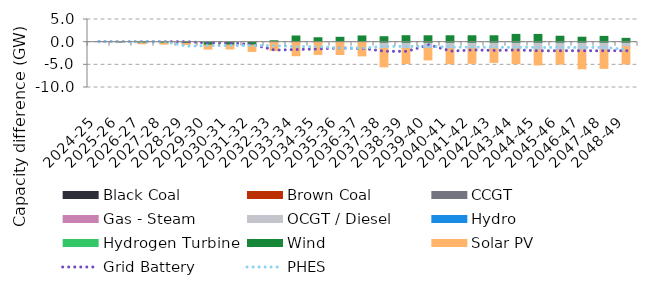
| Category | Black Coal | Brown Coal | CCGT | Gas - Steam | OCGT / Diesel | Hydro | Hydrogen Turbine | Wind | Solar PV |
|---|---|---|---|---|---|---|---|---|---|
| 2024-25 | 0 | 0 | 0 | 0 | 0 | 0 | 0 | 0 | 0 |
| 2025-26 | 0 | 0 | 0 | 0 | 0 | 0 | 0 | -0.058 | 0 |
| 2026-27 | 0 | 0 | 0 | 0 | 0 | 0 | 0 | -0.198 | -0.157 |
| 2027-28 | 0 | 0 | 0 | 0 | 0 | 0 | 0 | -0.218 | -0.213 |
| 2028-29 | 0 | 0 | 0 | 0 | 0 | 0 | 0 | -0.278 | -0.245 |
| 2029-30 | 0 | 0 | 0 | 0 | 0 | 0 | 0 | -0.662 | -0.872 |
| 2030-31 | 0 | 0 | 0 | 0 | 0 | 0 | 0 | -0.627 | -0.872 |
| 2031-32 | 0 | 0 | 0 | 0 | 0 | 0 | 0 | -0.627 | -1.42 |
| 2032-33 | 0 | 0 | 0 | 0 | 0 | 0 | 0 | 0.306 | -1.836 |
| 2033-34 | 0 | 0 | 0 | 0 | 0 | 0 | 0 | 1.358 | -2.982 |
| 2034-35 | 0 | 0 | 0 | 0 | 0 | 0 | 0 | 0.976 | -2.705 |
| 2035-36 | 0 | 0 | 0 | 0 | 0.096 | 0 | 0 | 0.976 | -2.721 |
| 2036-37 | 0 | 0 | 0 | 0 | 0.096 | 0 | 0 | 1.274 | -3.019 |
| 2037-38 | 0 | 0 | 0 | 0 | -1.409 | 0 | 0 | 1.204 | -4.031 |
| 2038-39 | 0 | 0 | 0 | 0 | -1.409 | 0 | 0 | 1.427 | -3.31 |
| 2039-40 | 0 | 0 | 0 | 0 | -1.409 | 0 | 0 | 1.405 | -2.517 |
| 2040-41 | 0 | 0 | 0 | 0 | -1.409 | 0 | 0 | 1.41 | -3.336 |
| 2041-42 | 0 | 0 | 0 | 0 | -1.372 | 0 | 0 | 1.41 | -3.299 |
| 2042-43 | 0 | 0 | 0 | 0 | -1.372 | 0 | 0 | 1.41 | -3.094 |
| 2043-44 | 0 | 0 | 0 | 0 | -1.484 | 0 | 0 | 1.711 | -3.258 |
| 2044-45 | 0 | 0 | 0 | 0 | -1.764 | 0 | 0 | 1.711 | -3.258 |
| 2045-46 | 0 | 0 | 0 | 0 | -1.764 | 0 | 0 | 1.307 | -3.074 |
| 2046-47 | 0 | 0 | 0 | 0 | -1.764 | 0 | 0 | 1.093 | -4.101 |
| 2047-48 | 0 | 0 | 0 | 0 | -1.764 | 0 | 0 | 1.277 | -4.023 |
| 2048-49 | 0 | 0 | 0 | 0 | -1.069 | 0 | 0 | 0.841 | -3.739 |